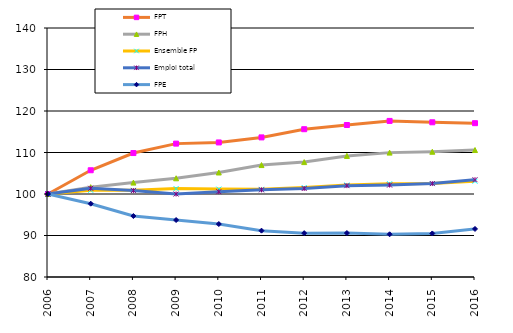
| Category | FPT | FPH | Ensemble FP | Emploi total | FPE |
|---|---|---|---|---|---|
| 2006.0 | 100 | 100 | 100 | 100 | 100 |
| 2007.0 | 105.719 | 101.65 | 100.896 | 101.377 | 97.664 |
| 2008.0 | 109.865 | 102.747 | 100.89 | 100.825 | 94.694 |
| 2009.0 | 112.139 | 103.787 | 101.305 | 99.996 | 93.73 |
| 2010.0 | 112.421 | 105.184 | 101.186 | 100.558 | 92.762 |
| 2011.0 | 113.64 | 106.972 | 101.117 | 101.004 | 91.17 |
| 2012.0 | 115.612 | 107.688 | 101.555 | 101.32 | 90.566 |
| 2013.0 | 116.625 | 109.176 | 102.172 | 102.012 | 90.594 |
| 2014.0 | 117.613 | 109.97 | 102.477 | 102.153 | 90.291 |
| 2015.0 | 117.281 | 110.178 | 102.521 | 102.511 | 90.497 |
| 2016.0 | 117.064 | 110.595 | 103.077 | 103.444 | 91.578 |